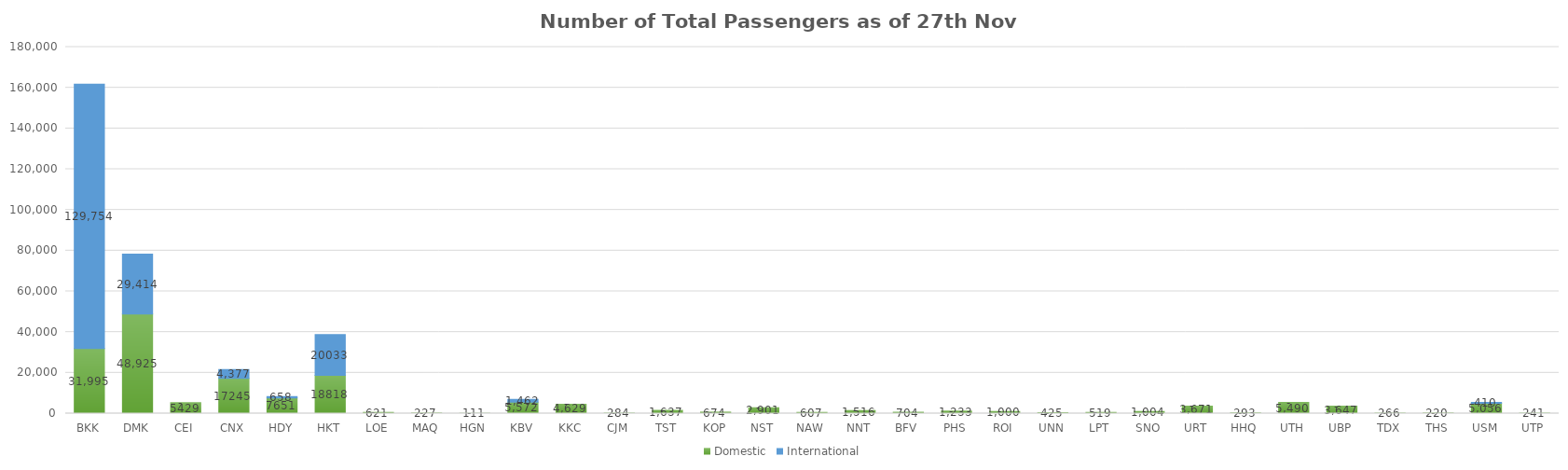
| Category | Domestic | International |
|---|---|---|
| BKK | 31995 | 129754 |
| DMK | 48925 | 29414 |
| CEI | 5429 | 0 |
| CNX | 17245 | 4377 |
| HDY | 7651 | 658 |
| HKT | 18818 | 20033 |
| LOE | 621 | 0 |
| MAQ | 227 | 0 |
| HGN | 111 | 0 |
| KBV | 5572 | 1462 |
| KKC | 4629 | 0 |
| CJM | 284 | 0 |
| TST | 1637 | 0 |
| KOP | 674 | 0 |
| NST | 2901 | 0 |
| NAW | 607 | 0 |
| NNT | 1516 | 0 |
| BFV | 704 | 0 |
| PHS | 1233 | 0 |
| ROI | 1000 | 0 |
| UNN | 425 | 0 |
| LPT | 519 | 0 |
| SNO | 1004 | 0 |
| URT | 3671 | 0 |
| HHQ | 293 | 0 |
| UTH | 5490 | 0 |
| UBP | 3647 | 0 |
| TDX | 266 | 0 |
| THS | 220 | 0 |
| USM | 5056 | 410 |
| UTP | 241 | 0 |